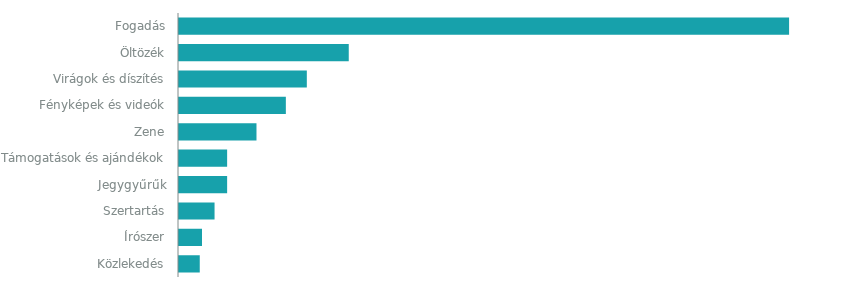
| Category | BECSÜLT KÖLTSÉG |
|---|---|
| Fogadás | 14500 |
| Öltözék | 4000 |
| Virágok és díszítés | 3000 |
| Fényképek és videók | 2500 |
| Zene | 1800 |
| Támogatások és ajándékok | 1100 |
| Jegygyűrűk | 1100 |
| Szertartás | 800 |
| Írószer | 500 |
| Közlekedés | 450 |